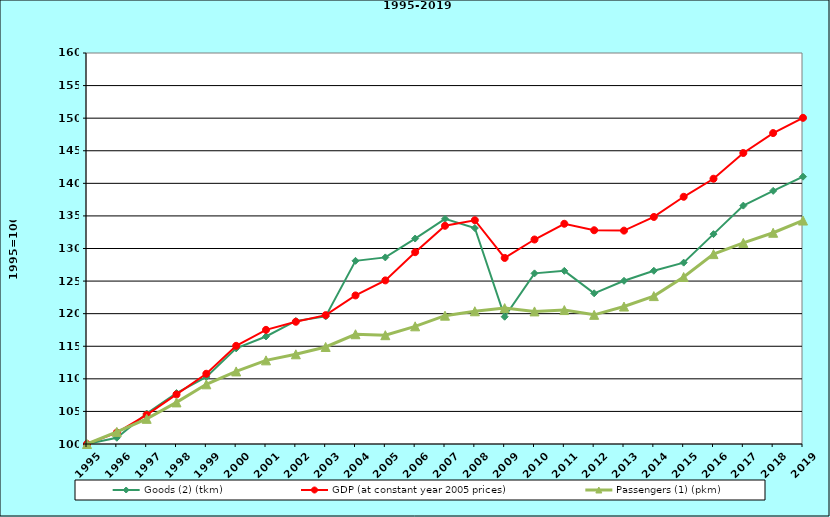
| Category | Goods (2) (tkm) | GDP (at constant year 2005 prices) | Passengers (1) (pkm) |
|---|---|---|---|
| 1995.0 | 100 | 100 | 100 |
| 1996.0 | 100.958 | 101.761 | 101.859 |
| 1997.0 | 104.672 | 104.468 | 103.861 |
| 1998.0 | 107.818 | 107.605 | 106.384 |
| 1999.0 | 110.302 | 110.78 | 109.157 |
| 2000.0 | 114.673 | 115.065 | 111.138 |
| 2001.0 | 116.499 | 117.517 | 112.837 |
| 2002.0 | 118.878 | 118.757 | 113.764 |
| 2003.0 | 119.58 | 119.775 | 114.889 |
| 2004.0 | 128.109 | 122.798 | 116.842 |
| 2005.0 | 128.633 | 125.106 | 116.697 |
| 2006.0 | 131.528 | 129.434 | 118.059 |
| 2007.0 | 134.553 | 133.489 | 119.694 |
| 2008.0 | 133.139 | 134.339 | 120.366 |
| 2009.0 | 119.531 | 128.554 | 120.854 |
| 2010.0 | 126.183 | 131.378 | 120.345 |
| 2011.0 | 126.571 | 133.795 | 120.551 |
| 2012.0 | 123.124 | 132.8 | 119.821 |
| 2013.0 | 125.046 | 132.746 | 121.094 |
| 2014.0 | 126.583 | 134.841 | 122.694 |
| 2015.0 | 127.828 | 137.936 | 125.625 |
| 2016.0 | 132.205 | 140.706 | 129.139 |
| 2017.0 | 136.58 | 144.655 | 130.863 |
| 2018.0 | 138.844 | 147.714 | 132.417 |
| 2019.0 | 141.022 | 150.054 | 134.29 |